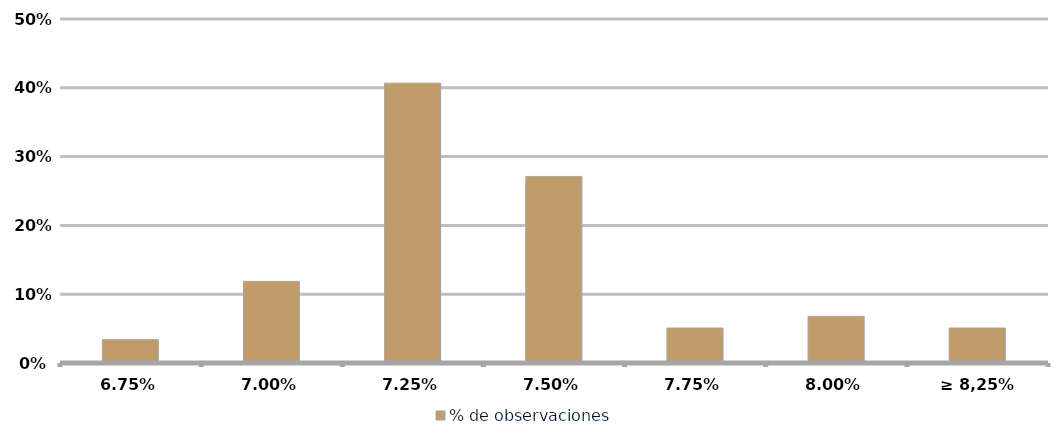
| Category | % de observaciones  |
|---|---|
| 6.75% | 0.034 |
| 7.00% | 0.119 |
| 7.25% | 0.407 |
| 7.50% | 0.271 |
| 7.75% | 0.051 |
| 8.00% | 0.068 |
| ≥ 8,25% | 0.051 |